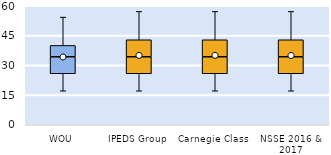
| Category | 25th | 50th | 75th |
|---|---|---|---|
| WOU | 25.714 | 8.571 | 5.714 |
| IPEDS Group | 25.714 | 8.571 | 8.571 |
| Carnegie Class | 25.714 | 8.571 | 8.571 |
| NSSE 2016 & 2017 | 25.714 | 8.571 | 8.571 |